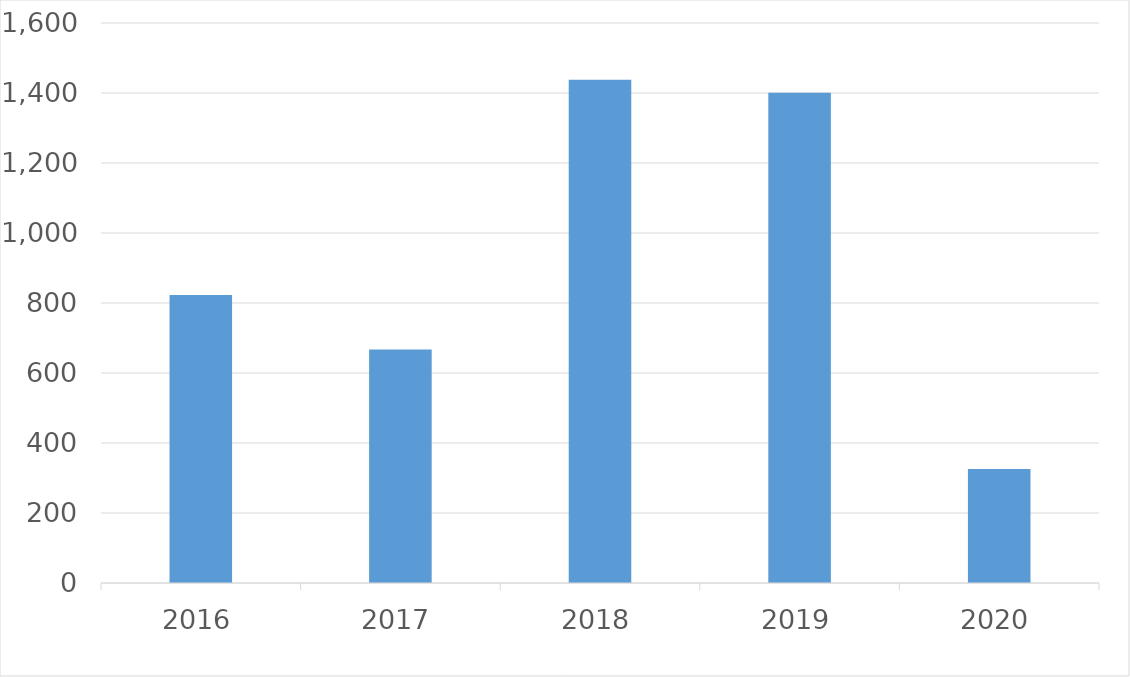
| Category | Series 0 |
|---|---|
| 2016 | 823 |
| 2017 | 667 |
| 2018 | 1438 |
| 2019 | 1401 |
| 2020 | 326 |